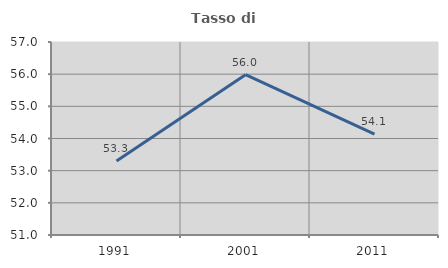
| Category | Tasso di occupazione   |
|---|---|
| 1991.0 | 53.297 |
| 2001.0 | 55.985 |
| 2011.0 | 54.135 |